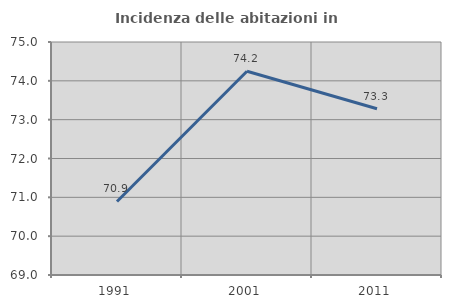
| Category | Incidenza delle abitazioni in proprietà  |
|---|---|
| 1991.0 | 70.894 |
| 2001.0 | 74.247 |
| 2011.0 | 73.282 |